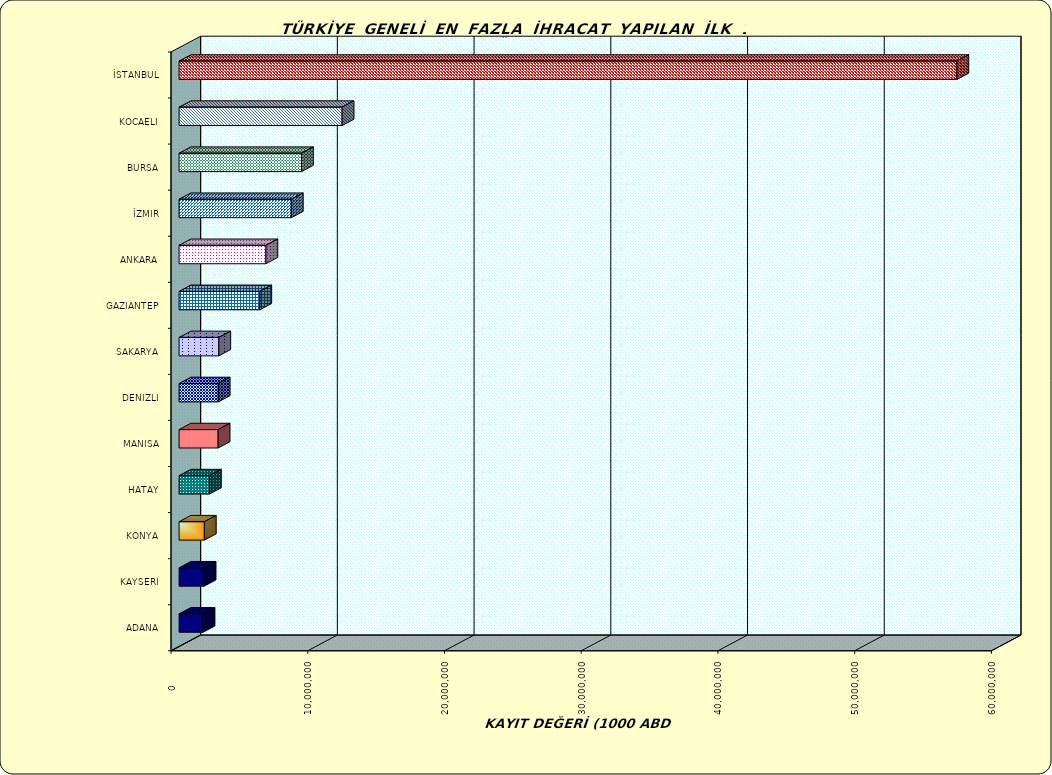
| Category | Series 0 |
|---|---|
| İSTANBUL | 56885292.854 |
| KOCAELI | 11925311.823 |
| BURSA | 8953599.58 |
| İZMIR | 8210028.592 |
| ANKARA | 6351553.086 |
| GAZIANTEP | 5905119.557 |
| SAKARYA | 2906765.656 |
| DENIZLI | 2864480.181 |
| MANISA | 2856224.639 |
| HATAY | 2220028.502 |
| KONYA | 1849080.797 |
| KAYSERI | 1831980.525 |
| ADANA | 1752605.736 |